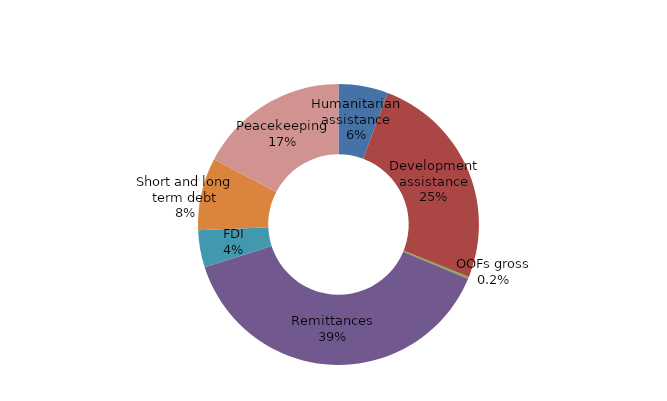
| Category | Series 0 |
|---|---|
| Humanitarian assistance | 0.237 |
| Development assistance | 1.058 |
| OOFs gross | 0.01 |
| Remittances | 1.612 |
| FDI | 0.179 |
| Short and long term debt | 0.346 |
| Portfolio equity | 0 |
| Peacekeeping | 0.721 |